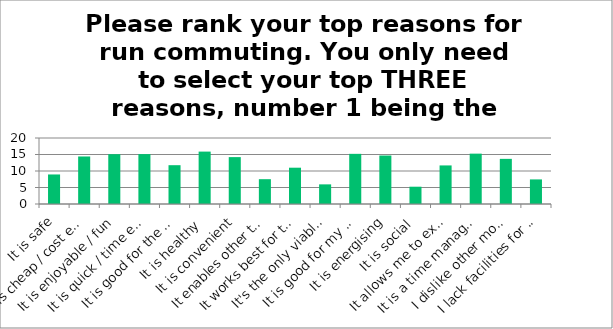
| Category | Score |
|---|---|
| It is safe | 8.95 |
| It is cheap / cost effective | 14.4 |
| It is enjoyable / fun | 15.09 |
| It is quick / time effective | 15.12 |
| It is good for the environment | 11.76 |
| It is healthy | 15.88 |
| It is convenient | 14.21 |
| It enables other things to be done on the commute | 7.52 |
| It works best for the transport needs of my household | 11 |
| It's the only viable option | 5.95 |
| It is good for my mental wellbeing | 15.2 |
| It is energising | 14.69 |
| It is social | 5.24 |
| It allows me to explore my surroundings | 11.69 |
| It is a time management strategy | 15.26 |
| I dislike other modes of transport | 13.68 |
| I lack facilities for other modes of transport | 7.45 |